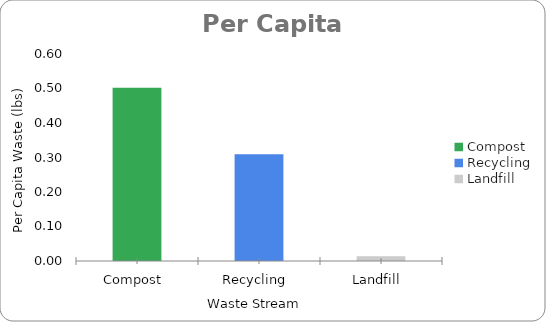
| Category | TOTALS  |
|---|---|
| Compost  | 0.502 |
| Recycling  | 0.309 |
| Landfill  | 0.013 |